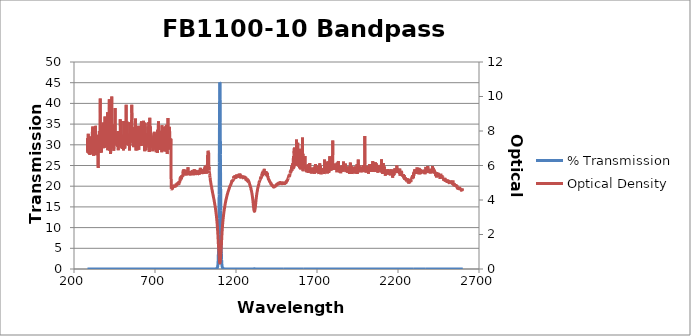
| Category | % Transmission |
|---|---|
| 2600.0 | 0.002 |
| 2599.0 | 0.002 |
| 2598.0 | 0.002 |
| 2597.0 | 0.003 |
| 2596.0 | 0.003 |
| 2595.0 | 0.003 |
| 2594.0 | 0.003 |
| 2593.0 | 0.003 |
| 2592.0 | 0.002 |
| 2591.0 | 0.003 |
| 2590.0 | 0.003 |
| 2589.0 | 0.003 |
| 2588.0 | 0.002 |
| 2587.0 | 0.002 |
| 2586.0 | 0.002 |
| 2585.0 | 0.002 |
| 2584.0 | 0.002 |
| 2583.0 | 0.002 |
| 2582.0 | 0.003 |
| 2581.0 | 0.002 |
| 2580.0 | 0.002 |
| 2579.0 | 0.002 |
| 2578.0 | 0.002 |
| 2577.0 | 0.002 |
| 2576.0 | 0.002 |
| 2575.0 | 0.002 |
| 2574.0 | 0.002 |
| 2573.0 | 0.002 |
| 2572.0 | 0.002 |
| 2571.0 | 0.002 |
| 2570.0 | 0.002 |
| 2569.0 | 0.002 |
| 2568.0 | 0.002 |
| 2567.0 | 0.002 |
| 2566.0 | 0.002 |
| 2565.0 | 0.002 |
| 2564.0 | 0.002 |
| 2563.0 | 0.002 |
| 2562.0 | 0.002 |
| 2561.0 | 0.002 |
| 2560.0 | 0.002 |
| 2559.0 | 0.001 |
| 2558.0 | 0.001 |
| 2557.0 | 0.002 |
| 2556.0 | 0.001 |
| 2555.0 | 0.001 |
| 2554.0 | 0.001 |
| 2553.0 | 0.002 |
| 2552.0 | 0.001 |
| 2551.0 | 0.001 |
| 2550.0 | 0.001 |
| 2549.0 | 0.001 |
| 2548.0 | 0.001 |
| 2547.0 | 0.001 |
| 2546.0 | 0.001 |
| 2545.0 | 0.001 |
| 2544.0 | 0.001 |
| 2543.0 | 0.001 |
| 2542.0 | 0.001 |
| 2541.0 | 0.001 |
| 2540.0 | 0.001 |
| 2539.0 | 0.001 |
| 2538.0 | 0.001 |
| 2537.0 | 0.001 |
| 2536.0 | 0.001 |
| 2535.0 | 0.001 |
| 2534.0 | 0.001 |
| 2533.0 | 0.001 |
| 2532.0 | 0.001 |
| 2531.0 | 0.001 |
| 2530.0 | 0.001 |
| 2529.0 | 0.001 |
| 2528.0 | 0.001 |
| 2527.0 | 0.001 |
| 2526.0 | 0.001 |
| 2525.0 | 0.001 |
| 2524.0 | 0.001 |
| 2523.0 | 0.001 |
| 2522.0 | 0.001 |
| 2521.0 | 0.001 |
| 2520.0 | 0.001 |
| 2519.0 | 0.001 |
| 2518.0 | 0.001 |
| 2517.0 | 0.001 |
| 2516.0 | 0.001 |
| 2515.0 | 0.001 |
| 2514.0 | 0.001 |
| 2513.0 | 0.001 |
| 2512.0 | 0.001 |
| 2511.0 | 0.001 |
| 2510.0 | 0.001 |
| 2509.0 | 0.001 |
| 2508.0 | 0.001 |
| 2507.0 | 0.001 |
| 2506.0 | 0.001 |
| 2505.0 | 0.001 |
| 2504.0 | 0.001 |
| 2503.0 | 0.001 |
| 2502.0 | 0.001 |
| 2501.0 | 0.001 |
| 2500.0 | 0.001 |
| 2499.0 | 0.001 |
| 2498.0 | 0.001 |
| 2497.0 | 0.001 |
| 2496.0 | 0.001 |
| 2495.0 | 0.001 |
| 2494.0 | 0.001 |
| 2493.0 | 0.001 |
| 2492.0 | 0.001 |
| 2491.0 | 0.001 |
| 2490.0 | 0.001 |
| 2489.0 | 0.001 |
| 2488.0 | 0.001 |
| 2487.0 | 0.001 |
| 2486.0 | 0.001 |
| 2485.0 | 0.001 |
| 2484.0 | 0.001 |
| 2483.0 | 0.001 |
| 2482.0 | 0.001 |
| 2481.0 | 0.001 |
| 2480.0 | 0.001 |
| 2479.0 | 0.001 |
| 2478.0 | 0.001 |
| 2477.0 | 0.001 |
| 2476.0 | 0 |
| 2475.0 | 0 |
| 2474.0 | 0.001 |
| 2473.0 | 0 |
| 2472.0 | 0.001 |
| 2471.0 | 0 |
| 2470.0 | 0 |
| 2469.0 | 0 |
| 2468.0 | 0 |
| 2467.0 | 0.001 |
| 2466.0 | 0 |
| 2465.0 | 0 |
| 2464.0 | 0 |
| 2463.0 | 0 |
| 2462.0 | 0 |
| 2461.0 | 0 |
| 2460.0 | 0.001 |
| 2459.0 | 0 |
| 2458.0 | 0 |
| 2457.0 | 0 |
| 2456.0 | 0 |
| 2455.0 | 0 |
| 2454.0 | 0 |
| 2453.0 | 0 |
| 2452.0 | 0 |
| 2451.0 | 0 |
| 2450.0 | 0 |
| 2449.0 | 0 |
| 2448.0 | 0 |
| 2447.0 | 0 |
| 2446.0 | 0 |
| 2445.0 | 0 |
| 2444.0 | 0 |
| 2443.0 | 0 |
| 2442.0 | 0 |
| 2441.0 | 0 |
| 2440.0 | 0 |
| 2439.0 | 0 |
| 2438.0 | 0 |
| 2437.0 | 0 |
| 2436.0 | 0 |
| 2435.0 | 0 |
| 2434.0 | 0 |
| 2433.0 | 0 |
| 2432.0 | 0 |
| 2431.0 | 0 |
| 2430.0 | 0 |
| 2429.0 | 0 |
| 2428.0 | 0 |
| 2427.0 | 0 |
| 2426.0 | 0 |
| 2425.0 | 0 |
| 2424.0 | 0 |
| 2423.0 | 0 |
| 2422.0 | 0 |
| 2421.0 | 0 |
| 2420.0 | 0 |
| 2419.0 | 0 |
| 2418.0 | 0 |
| 2417.0 | 0 |
| 2416.0 | 0 |
| 2415.0 | 0 |
| 2414.0 | 0 |
| 2413.0 | 0 |
| 2412.0 | 0 |
| 2411.0 | 0 |
| 2410.0 | 0 |
| 2409.0 | 0 |
| 2408.0 | 0 |
| 2407.0 | 0 |
| 2406.0 | 0 |
| 2405.0 | 0 |
| 2404.0 | 0 |
| 2403.0 | 0 |
| 2402.0 | 0 |
| 2401.0 | 0 |
| 2400.0 | 0 |
| 2399.0 | 0 |
| 2398.0 | 0 |
| 2397.0 | 0 |
| 2396.0 | 0 |
| 2395.0 | 0 |
| 2394.0 | 0 |
| 2393.0 | 0 |
| 2392.0 | 0 |
| 2391.0 | 0 |
| 2390.0 | 0 |
| 2389.0 | 0 |
| 2388.0 | 0 |
| 2387.0 | 0 |
| 2386.0 | 0 |
| 2385.0 | 0 |
| 2384.0 | 0 |
| 2383.0 | 0 |
| 2382.0 | 0 |
| 2381.0 | 0 |
| 2380.0 | 0 |
| 2379.0 | 0 |
| 2378.0 | 0 |
| 2377.0 | 0 |
| 2376.0 | 0 |
| 2375.0 | 0 |
| 2374.0 | 0 |
| 2373.0 | 0 |
| 2372.0 | 0 |
| 2371.0 | 0 |
| 2370.0 | 0 |
| 2369.0 | 0 |
| 2368.0 | 0 |
| 2367.0 | 0 |
| 2366.0 | 0 |
| 2365.0 | 0 |
| 2364.0 | 0 |
| 2363.0 | 0 |
| 2362.0 | 0 |
| 2361.0 | 0 |
| 2360.0 | 0 |
| 2359.0 | 0 |
| 2358.0 | 0 |
| 2357.0 | 0 |
| 2356.0 | 0 |
| 2355.0 | 0 |
| 2354.0 | 0 |
| 2353.0 | 0 |
| 2352.0 | 0 |
| 2351.0 | 0 |
| 2350.0 | 0 |
| 2349.0 | 0 |
| 2348.0 | 0 |
| 2347.0 | 0 |
| 2346.0 | 0 |
| 2345.0 | 0 |
| 2344.0 | 0 |
| 2343.0 | 0 |
| 2342.0 | 0 |
| 2341.0 | 0 |
| 2340.0 | 0 |
| 2339.0 | 0 |
| 2338.0 | 0 |
| 2337.0 | 0 |
| 2336.0 | 0 |
| 2335.0 | 0 |
| 2334.0 | 0 |
| 2333.0 | 0 |
| 2332.0 | 0 |
| 2331.0 | 0 |
| 2330.0 | 0 |
| 2329.0 | 0 |
| 2328.0 | 0 |
| 2327.0 | 0 |
| 2326.0 | 0 |
| 2325.0 | 0 |
| 2324.0 | 0 |
| 2323.0 | 0 |
| 2322.0 | 0 |
| 2321.0 | 0 |
| 2320.0 | 0 |
| 2319.0 | 0 |
| 2318.0 | 0 |
| 2317.0 | 0 |
| 2316.0 | 0 |
| 2315.0 | 0 |
| 2314.0 | 0 |
| 2313.0 | 0 |
| 2312.0 | 0 |
| 2311.0 | 0 |
| 2310.0 | 0 |
| 2309.0 | 0 |
| 2308.0 | 0 |
| 2307.0 | 0 |
| 2306.0 | 0 |
| 2305.0 | 0 |
| 2304.0 | 0 |
| 2303.0 | 0 |
| 2302.0 | 0 |
| 2301.0 | 0 |
| 2300.0 | 0 |
| 2299.0 | 0 |
| 2298.0 | 0 |
| 2297.0 | 0 |
| 2296.0 | 0 |
| 2295.0 | 0.001 |
| 2294.0 | 0 |
| 2293.0 | 0.001 |
| 2292.0 | 0 |
| 2291.0 | 0 |
| 2290.0 | 0.001 |
| 2289.0 | 0 |
| 2288.0 | 0.001 |
| 2287.0 | 0 |
| 2286.0 | 0.001 |
| 2285.0 | 0.001 |
| 2284.0 | 0.001 |
| 2283.0 | 0.001 |
| 2282.0 | 0.001 |
| 2281.0 | 0.001 |
| 2280.0 | 0.001 |
| 2279.0 | 0.001 |
| 2278.0 | 0.001 |
| 2277.0 | 0.001 |
| 2276.0 | 0.001 |
| 2275.0 | 0.001 |
| 2274.0 | 0.001 |
| 2273.0 | 0.001 |
| 2272.0 | 0.001 |
| 2271.0 | 0.001 |
| 2270.0 | 0.001 |
| 2269.0 | 0.001 |
| 2268.0 | 0.001 |
| 2267.0 | 0.001 |
| 2266.0 | 0.001 |
| 2265.0 | 0.001 |
| 2264.0 | 0.001 |
| 2263.0 | 0.001 |
| 2262.0 | 0.001 |
| 2261.0 | 0.001 |
| 2260.0 | 0.001 |
| 2259.0 | 0.001 |
| 2258.0 | 0.001 |
| 2257.0 | 0.001 |
| 2256.0 | 0.001 |
| 2255.0 | 0.001 |
| 2254.0 | 0.001 |
| 2253.0 | 0.001 |
| 2252.0 | 0.001 |
| 2251.0 | 0.001 |
| 2250.0 | 0.001 |
| 2249.0 | 0.001 |
| 2248.0 | 0.001 |
| 2247.0 | 0.001 |
| 2246.0 | 0.001 |
| 2245.0 | 0.001 |
| 2244.0 | 0 |
| 2243.0 | 0.001 |
| 2242.0 | 0.001 |
| 2241.0 | 0 |
| 2240.0 | 0.001 |
| 2239.0 | 0 |
| 2238.0 | 0 |
| 2237.0 | 0 |
| 2236.0 | 0.001 |
| 2235.0 | 0 |
| 2234.0 | 0 |
| 2233.0 | 0 |
| 2232.0 | 0 |
| 2231.0 | 0 |
| 2230.0 | 0 |
| 2229.0 | 0 |
| 2228.0 | 0 |
| 2227.0 | 0 |
| 2226.0 | 0 |
| 2225.0 | 0 |
| 2224.0 | 0 |
| 2223.0 | 0 |
| 2222.0 | 0 |
| 2221.0 | 0 |
| 2220.0 | 0 |
| 2219.0 | 0 |
| 2218.0 | 0 |
| 2217.0 | 0 |
| 2216.0 | 0 |
| 2215.0 | 0 |
| 2214.0 | 0 |
| 2213.0 | 0 |
| 2212.0 | 0 |
| 2211.0 | 0 |
| 2210.0 | 0 |
| 2209.0 | 0 |
| 2208.0 | 0 |
| 2207.0 | 0 |
| 2206.0 | 0 |
| 2205.0 | 0 |
| 2204.0 | 0 |
| 2203.0 | 0 |
| 2202.0 | 0 |
| 2201.0 | 0 |
| 2200.0 | 0 |
| 2199.0 | 0 |
| 2198.0 | 0 |
| 2197.0 | 0 |
| 2196.0 | 0 |
| 2195.0 | 0 |
| 2194.0 | 0 |
| 2193.0 | 0 |
| 2192.0 | 0 |
| 2191.0 | 0 |
| 2190.0 | 0 |
| 2189.0 | 0 |
| 2188.0 | 0 |
| 2187.0 | 0 |
| 2186.0 | 0 |
| 2185.0 | 0 |
| 2184.0 | 0 |
| 2183.0 | 0 |
| 2182.0 | 0 |
| 2181.0 | 0 |
| 2180.0 | 0 |
| 2179.0 | 0 |
| 2178.0 | 0 |
| 2177.0 | 0 |
| 2176.0 | 0 |
| 2175.0 | 0 |
| 2174.0 | 0 |
| 2173.0 | 0 |
| 2172.0 | 0 |
| 2171.0 | 0 |
| 2170.0 | 0 |
| 2169.0 | 0 |
| 2168.0 | 0 |
| 2167.0 | 0.001 |
| 2166.0 | 0 |
| 2165.0 | 0 |
| 2164.0 | 0 |
| 2163.0 | 0 |
| 2162.0 | 0 |
| 2161.0 | 0 |
| 2160.0 | 0 |
| 2159.0 | 0 |
| 2158.0 | 0 |
| 2157.0 | 0 |
| 2156.0 | 0 |
| 2155.0 | 0 |
| 2154.0 | 0 |
| 2153.0 | 0 |
| 2152.0 | 0 |
| 2151.0 | 0 |
| 2150.0 | 0 |
| 2149.0 | 0 |
| 2148.0 | 0 |
| 2147.0 | 0 |
| 2146.0 | 0 |
| 2145.0 | 0 |
| 2144.0 | 0 |
| 2143.0 | 0 |
| 2142.0 | 0 |
| 2141.0 | 0 |
| 2140.0 | 0 |
| 2139.0 | 0 |
| 2138.0 | 0 |
| 2137.0 | 0 |
| 2136.0 | 0 |
| 2135.0 | 0 |
| 2134.0 | 0 |
| 2133.0 | 0 |
| 2132.0 | 0 |
| 2131.0 | 0 |
| 2130.0 | 0 |
| 2129.0 | 0 |
| 2128.0 | 0 |
| 2127.0 | 0 |
| 2126.0 | 0 |
| 2125.0 | 0 |
| 2124.0 | 0 |
| 2123.0 | 0 |
| 2122.0 | 0 |
| 2121.0 | 0 |
| 2120.0 | 0 |
| 2119.0 | 0 |
| 2118.0 | 0 |
| 2117.0 | 0 |
| 2116.0 | 0 |
| 2115.0 | 0 |
| 2114.0 | 0 |
| 2113.0 | 0 |
| 2112.0 | 0 |
| 2111.0 | 0 |
| 2110.0 | 0 |
| 2109.0 | 0 |
| 2108.0 | 0 |
| 2107.0 | 0 |
| 2106.0 | 0 |
| 2105.0 | 0 |
| 2104.0 | 0 |
| 2103.0 | 0 |
| 2102.0 | 0 |
| 2101.0 | 0 |
| 2100.0 | 0 |
| 2099.0 | 0 |
| 2098.0 | 0 |
| 2097.0 | 0 |
| 2096.0 | 0 |
| 2095.0 | 0 |
| 2094.0 | 0 |
| 2093.0 | 0 |
| 2092.0 | 0 |
| 2091.0 | 0 |
| 2090.0 | 0 |
| 2089.0 | 0 |
| 2088.0 | 0 |
| 2087.0 | 0 |
| 2086.0 | 0 |
| 2085.0 | 0 |
| 2084.0 | 0 |
| 2083.0 | 0 |
| 2082.0 | 0 |
| 2081.0 | 0 |
| 2080.0 | 0 |
| 2079.0 | 0 |
| 2078.0 | 0 |
| 2077.0 | 0 |
| 2076.0 | 0 |
| 2075.0 | 0 |
| 2074.0 | 0 |
| 2073.0 | 0 |
| 2072.0 | 0 |
| 2071.0 | 0 |
| 2070.0 | 0 |
| 2069.0 | 0 |
| 2068.0 | 0 |
| 2067.0 | 0 |
| 2066.0 | 0 |
| 2065.0 | 0 |
| 2064.0 | 0 |
| 2063.0 | 0 |
| 2062.0 | 0 |
| 2061.0 | 0 |
| 2060.0 | 0 |
| 2059.0 | 0 |
| 2058.0 | 0 |
| 2057.0 | 0 |
| 2056.0 | 0 |
| 2055.0 | 0 |
| 2054.0 | 0 |
| 2053.0 | 0 |
| 2052.0 | 0 |
| 2051.0 | 0 |
| 2050.0 | 0 |
| 2049.0 | 0 |
| 2048.0 | 0 |
| 2047.0 | 0 |
| 2046.0 | 0 |
| 2045.0 | 0 |
| 2044.0 | 0 |
| 2043.0 | 0 |
| 2042.0 | 0 |
| 2041.0 | 0 |
| 2040.0 | 0 |
| 2039.0 | 0 |
| 2038.0 | 0 |
| 2037.0 | 0 |
| 2036.0 | 0 |
| 2035.0 | 0 |
| 2034.0 | 0 |
| 2033.0 | 0 |
| 2032.0 | 0 |
| 2031.0 | 0 |
| 2030.0 | 0 |
| 2029.0 | 0 |
| 2028.0 | 0 |
| 2027.0 | 0 |
| 2026.0 | 0 |
| 2025.0 | 0 |
| 2024.0 | 0 |
| 2023.0 | 0 |
| 2022.0 | 0 |
| 2021.0 | 0 |
| 2020.0 | 0 |
| 2019.0 | 0 |
| 2018.0 | 0 |
| 2017.0 | 0 |
| 2016.0 | 0 |
| 2015.0 | 0 |
| 2014.0 | 0 |
| 2013.0 | 0 |
| 2012.0 | 0 |
| 2011.0 | 0 |
| 2010.0 | 0 |
| 2009.0 | 0 |
| 2008.0 | 0 |
| 2007.0 | 0 |
| 2006.0 | 0 |
| 2005.0 | 0 |
| 2004.0 | 0 |
| 2003.0 | 0 |
| 2002.0 | 0 |
| 2001.0 | 0 |
| 2000.0 | 0 |
| 1999.0 | 0 |
| 1998.0 | 0 |
| 1997.0 | 0 |
| 1996.0 | 0 |
| 1995.0 | 0 |
| 1994.0 | 0 |
| 1993.0 | 0 |
| 1992.0 | 0 |
| 1991.0 | 0 |
| 1990.0 | 0 |
| 1989.0 | 0 |
| 1988.0 | 0 |
| 1987.0 | 0 |
| 1986.0 | 0 |
| 1985.0 | 0 |
| 1984.0 | 0 |
| 1983.0 | 0 |
| 1982.0 | 0 |
| 1981.0 | 0 |
| 1980.0 | 0 |
| 1979.0 | 0 |
| 1978.0 | 0 |
| 1977.0 | 0 |
| 1976.0 | 0 |
| 1975.0 | 0 |
| 1974.0 | 0 |
| 1973.0 | 0 |
| 1972.0 | 0 |
| 1971.0 | 0 |
| 1970.0 | 0 |
| 1969.0 | 0 |
| 1968.0 | 0 |
| 1967.0 | 0 |
| 1966.0 | 0 |
| 1965.0 | 0 |
| 1964.0 | 0 |
| 1963.0 | 0 |
| 1962.0 | 0 |
| 1961.0 | 0 |
| 1960.0 | 0 |
| 1959.0 | 0 |
| 1958.0 | 0 |
| 1957.0 | 0 |
| 1956.0 | 0 |
| 1955.0 | 0 |
| 1954.0 | 0 |
| 1953.0 | 0 |
| 1952.0 | 0 |
| 1951.0 | 0 |
| 1950.0 | 0 |
| 1949.0 | 0 |
| 1948.0 | 0 |
| 1947.0 | 0 |
| 1946.0 | 0 |
| 1945.0 | 0 |
| 1944.0 | 0 |
| 1943.0 | 0 |
| 1942.0 | 0 |
| 1941.0 | 0 |
| 1940.0 | 0 |
| 1939.0 | 0 |
| 1938.0 | 0 |
| 1937.0 | 0 |
| 1936.0 | 0 |
| 1935.0 | 0 |
| 1934.0 | 0 |
| 1933.0 | 0 |
| 1932.0 | 0 |
| 1931.0 | 0 |
| 1930.0 | 0 |
| 1929.0 | 0 |
| 1928.0 | 0 |
| 1927.0 | 0 |
| 1926.0 | 0 |
| 1925.0 | 0 |
| 1924.0 | 0 |
| 1923.0 | 0 |
| 1922.0 | 0 |
| 1921.0 | 0 |
| 1920.0 | 0 |
| 1919.0 | 0 |
| 1918.0 | 0 |
| 1917.0 | 0 |
| 1916.0 | 0 |
| 1915.0 | 0 |
| 1914.0 | 0 |
| 1913.0 | 0 |
| 1912.0 | 0 |
| 1911.0 | 0 |
| 1910.0 | 0 |
| 1909.0 | 0 |
| 1908.0 | 0 |
| 1907.0 | 0 |
| 1906.0 | 0 |
| 1905.0 | 0 |
| 1904.0 | 0 |
| 1903.0 | 0 |
| 1902.0 | 0 |
| 1901.0 | 0 |
| 1900.0 | 0 |
| 1899.0 | 0 |
| 1898.0 | 0 |
| 1897.0 | 0 |
| 1896.0 | 0 |
| 1895.0 | 0 |
| 1894.0 | 0 |
| 1893.0 | 0 |
| 1892.0 | 0 |
| 1891.0 | 0 |
| 1890.0 | 0 |
| 1889.0 | 0 |
| 1888.0 | 0 |
| 1887.0 | 0 |
| 1886.0 | 0 |
| 1885.0 | 0 |
| 1884.0 | 0 |
| 1883.0 | 0 |
| 1882.0 | 0 |
| 1881.0 | 0 |
| 1880.0 | 0 |
| 1879.0 | 0 |
| 1878.0 | 0 |
| 1877.0 | 0 |
| 1876.0 | 0 |
| 1875.0 | 0 |
| 1874.0 | 0 |
| 1873.0 | 0 |
| 1872.0 | 0 |
| 1871.0 | 0 |
| 1870.0 | 0 |
| 1869.0 | 0 |
| 1868.0 | 0 |
| 1867.0 | 0 |
| 1866.0 | 0 |
| 1865.0 | 0 |
| 1864.0 | 0 |
| 1863.0 | 0 |
| 1862.0 | 0 |
| 1861.0 | 0 |
| 1860.0 | 0 |
| 1859.0 | 0 |
| 1858.0 | 0 |
| 1857.0 | 0 |
| 1856.0 | 0 |
| 1855.0 | 0 |
| 1854.0 | 0 |
| 1853.0 | 0 |
| 1852.0 | 0 |
| 1851.0 | 0 |
| 1850.0 | 0 |
| 1849.0 | 0 |
| 1848.0 | 0 |
| 1847.0 | 0 |
| 1846.0 | 0 |
| 1845.0 | 0 |
| 1844.0 | 0 |
| 1843.0 | 0 |
| 1842.0 | 0 |
| 1841.0 | 0 |
| 1840.0 | 0 |
| 1839.0 | 0 |
| 1838.0 | 0 |
| 1837.0 | 0 |
| 1836.0 | 0 |
| 1835.0 | 0 |
| 1834.0 | 0 |
| 1833.0 | 0 |
| 1832.0 | 0 |
| 1831.0 | 0 |
| 1830.0 | 0 |
| 1829.0 | 0 |
| 1828.0 | 0 |
| 1827.0 | 0 |
| 1826.0 | 0 |
| 1825.0 | 0 |
| 1824.0 | 0 |
| 1823.0 | 0 |
| 1822.0 | 0 |
| 1821.0 | 0 |
| 1820.0 | 0 |
| 1819.0 | 0 |
| 1818.0 | 0 |
| 1817.0 | 0 |
| 1816.0 | 0 |
| 1815.0 | 0 |
| 1814.0 | 0 |
| 1813.0 | 0 |
| 1812.0 | 0 |
| 1811.0 | 0 |
| 1810.0 | 0 |
| 1809.0 | 0 |
| 1808.0 | 0 |
| 1807.0 | 0 |
| 1806.0 | 0 |
| 1805.0 | 0 |
| 1804.0 | 0 |
| 1803.0 | 0 |
| 1802.0 | 0 |
| 1801.0 | 0 |
| 1800.0 | 0 |
| 1799.0 | 0 |
| 1798.0 | 0 |
| 1797.0 | 0 |
| 1796.0 | 0 |
| 1795.0 | 0 |
| 1794.0 | 0 |
| 1793.0 | 0 |
| 1792.0 | 0 |
| 1791.0 | 0 |
| 1790.0 | 0 |
| 1789.0 | 0 |
| 1788.0 | 0 |
| 1787.0 | 0 |
| 1786.0 | 0 |
| 1785.0 | 0 |
| 1784.0 | 0 |
| 1783.0 | 0 |
| 1782.0 | 0 |
| 1781.0 | 0 |
| 1780.0 | 0 |
| 1779.0 | 0 |
| 1778.0 | 0 |
| 1777.0 | 0 |
| 1776.0 | 0 |
| 1775.0 | 0 |
| 1774.0 | 0 |
| 1773.0 | 0 |
| 1772.0 | 0 |
| 1771.0 | 0 |
| 1770.0 | 0 |
| 1769.0 | 0 |
| 1768.0 | 0 |
| 1767.0 | 0 |
| 1766.0 | 0 |
| 1765.0 | 0 |
| 1764.0 | 0 |
| 1763.0 | 0 |
| 1762.0 | 0 |
| 1761.0 | 0 |
| 1760.0 | 0 |
| 1759.0 | 0 |
| 1758.0 | 0 |
| 1757.0 | 0 |
| 1756.0 | 0 |
| 1755.0 | 0 |
| 1754.0 | 0 |
| 1753.0 | 0 |
| 1752.0 | 0 |
| 1751.0 | 0 |
| 1750.0 | 0 |
| 1749.0 | 0 |
| 1748.0 | 0 |
| 1747.0 | 0 |
| 1746.0 | 0 |
| 1745.0 | 0 |
| 1744.0 | 0 |
| 1743.0 | 0 |
| 1742.0 | 0 |
| 1741.0 | 0 |
| 1740.0 | 0 |
| 1739.0 | 0 |
| 1738.0 | 0 |
| 1737.0 | 0 |
| 1736.0 | 0 |
| 1735.0 | 0 |
| 1734.0 | 0 |
| 1733.0 | 0 |
| 1732.0 | 0 |
| 1731.0 | 0 |
| 1730.0 | 0 |
| 1729.0 | 0 |
| 1728.0 | 0 |
| 1727.0 | 0 |
| 1726.0 | 0 |
| 1725.0 | 0 |
| 1724.0 | 0 |
| 1723.0 | 0 |
| 1722.0 | 0 |
| 1721.0 | 0 |
| 1720.0 | 0 |
| 1719.0 | 0 |
| 1718.0 | 0 |
| 1717.0 | 0 |
| 1716.0 | 0 |
| 1715.0 | 0 |
| 1714.0 | 0 |
| 1713.0 | 0 |
| 1712.0 | 0 |
| 1711.0 | 0 |
| 1710.0 | 0 |
| 1709.0 | 0 |
| 1708.0 | 0 |
| 1707.0 | 0 |
| 1706.0 | 0 |
| 1705.0 | 0 |
| 1704.0 | 0 |
| 1703.0 | 0 |
| 1702.0 | 0 |
| 1701.0 | 0 |
| 1700.0 | 0 |
| 1699.0 | 0 |
| 1698.0 | 0 |
| 1697.0 | 0 |
| 1696.0 | 0 |
| 1695.0 | 0 |
| 1694.0 | 0 |
| 1693.0 | 0 |
| 1692.0 | 0 |
| 1691.0 | 0 |
| 1690.0 | 0 |
| 1689.0 | 0 |
| 1688.0 | 0 |
| 1687.0 | 0 |
| 1686.0 | 0 |
| 1685.0 | 0 |
| 1684.0 | 0 |
| 1683.0 | 0 |
| 1682.0 | 0 |
| 1681.0 | 0 |
| 1680.0 | 0 |
| 1679.0 | 0 |
| 1678.0 | 0 |
| 1677.0 | 0 |
| 1676.0 | 0 |
| 1675.0 | 0 |
| 1674.0 | 0 |
| 1673.0 | 0 |
| 1672.0 | 0 |
| 1671.0 | 0 |
| 1670.0 | 0 |
| 1669.0 | 0 |
| 1668.0 | 0 |
| 1667.0 | 0 |
| 1666.0 | 0 |
| 1665.0 | 0 |
| 1664.0 | 0 |
| 1663.0 | 0 |
| 1662.0 | 0 |
| 1661.0 | 0 |
| 1660.0 | 0 |
| 1659.0 | 0 |
| 1658.0 | 0 |
| 1657.0 | 0 |
| 1656.0 | 0 |
| 1655.0 | 0 |
| 1654.0 | 0 |
| 1653.0 | 0 |
| 1652.0 | 0 |
| 1651.0 | 0 |
| 1650.0 | 0 |
| 1649.0 | 0 |
| 1648.0 | 0 |
| 1647.0 | 0 |
| 1646.0 | 0 |
| 1645.0 | 0 |
| 1644.0 | 0 |
| 1643.0 | 0 |
| 1642.0 | 0 |
| 1641.0 | 0 |
| 1640.0 | 0 |
| 1639.0 | 0 |
| 1638.0 | 0 |
| 1637.0 | 0 |
| 1636.0 | 0 |
| 1635.0 | 0 |
| 1634.0 | 0 |
| 1633.0 | 0 |
| 1632.0 | 0 |
| 1631.0 | 0 |
| 1630.0 | 0 |
| 1629.0 | 0 |
| 1628.0 | 0 |
| 1627.0 | 0 |
| 1626.0 | 0 |
| 1625.0 | 0 |
| 1624.0 | 0 |
| 1623.0 | 0 |
| 1622.0 | 0 |
| 1621.0 | 0 |
| 1620.0 | 0 |
| 1619.0 | 0 |
| 1618.0 | 0 |
| 1617.0 | 0 |
| 1616.0 | 0 |
| 1615.0 | 0 |
| 1614.0 | 0 |
| 1613.0 | 0 |
| 1612.0 | 0 |
| 1611.0 | 0 |
| 1610.0 | 0 |
| 1609.0 | 0 |
| 1608.0 | 0 |
| 1607.0 | 0 |
| 1606.0 | 0 |
| 1605.0 | 0 |
| 1604.0 | 0 |
| 1603.0 | 0 |
| 1602.0 | 0 |
| 1601.0 | 0 |
| 1600.0 | 0 |
| 1599.0 | 0 |
| 1598.0 | 0 |
| 1597.0 | 0 |
| 1596.0 | 0 |
| 1595.0 | 0 |
| 1594.0 | 0 |
| 1593.0 | 0 |
| 1592.0 | 0 |
| 1591.0 | 0 |
| 1590.0 | 0 |
| 1589.0 | 0 |
| 1588.0 | 0 |
| 1587.0 | 0 |
| 1586.0 | 0 |
| 1585.0 | 0 |
| 1584.0 | 0 |
| 1583.0 | 0 |
| 1582.0 | 0 |
| 1581.0 | 0 |
| 1580.0 | 0 |
| 1579.0 | 0 |
| 1578.0 | 0 |
| 1577.0 | 0 |
| 1576.0 | 0 |
| 1575.0 | 0 |
| 1574.0 | 0 |
| 1573.0 | 0 |
| 1572.0 | 0 |
| 1571.0 | 0 |
| 1570.0 | 0 |
| 1569.0 | 0 |
| 1568.0 | 0 |
| 1567.0 | 0 |
| 1566.0 | 0 |
| 1565.0 | 0 |
| 1564.0 | 0 |
| 1563.0 | 0 |
| 1562.0 | 0 |
| 1561.0 | 0 |
| 1560.0 | 0 |
| 1559.0 | 0 |
| 1558.0 | 0 |
| 1557.0 | 0 |
| 1556.0 | 0 |
| 1555.0 | 0 |
| 1554.0 | 0 |
| 1553.0 | 0 |
| 1552.0 | 0 |
| 1551.0 | 0 |
| 1550.0 | 0 |
| 1549.0 | 0 |
| 1548.0 | 0 |
| 1547.0 | 0 |
| 1546.0 | 0 |
| 1545.0 | 0 |
| 1544.0 | 0 |
| 1543.0 | 0 |
| 1542.0 | 0 |
| 1541.0 | 0 |
| 1540.0 | 0 |
| 1539.0 | 0 |
| 1538.0 | 0 |
| 1537.0 | 0 |
| 1536.0 | 0 |
| 1535.0 | 0 |
| 1534.0 | 0 |
| 1533.0 | 0 |
| 1532.0 | 0 |
| 1531.0 | 0 |
| 1530.0 | 0 |
| 1529.0 | 0 |
| 1528.0 | 0 |
| 1527.0 | 0 |
| 1526.0 | 0 |
| 1525.0 | 0 |
| 1524.0 | 0.001 |
| 1523.0 | 0 |
| 1522.0 | 0.001 |
| 1521.0 | 0.001 |
| 1520.0 | 0.001 |
| 1519.0 | 0.001 |
| 1518.0 | 0.001 |
| 1517.0 | 0.001 |
| 1516.0 | 0.001 |
| 1515.0 | 0.001 |
| 1514.0 | 0.001 |
| 1513.0 | 0.001 |
| 1512.0 | 0.001 |
| 1511.0 | 0.001 |
| 1510.0 | 0.001 |
| 1509.0 | 0.001 |
| 1508.0 | 0.001 |
| 1507.0 | 0.001 |
| 1506.0 | 0.001 |
| 1505.0 | 0.001 |
| 1504.0 | 0.001 |
| 1503.0 | 0.001 |
| 1502.0 | 0.001 |
| 1501.0 | 0.001 |
| 1500.0 | 0.001 |
| 1499.0 | 0.001 |
| 1498.0 | 0.001 |
| 1497.0 | 0.001 |
| 1496.0 | 0.001 |
| 1495.0 | 0.001 |
| 1494.0 | 0.001 |
| 1493.0 | 0.001 |
| 1492.0 | 0.001 |
| 1491.0 | 0.001 |
| 1490.0 | 0.001 |
| 1489.0 | 0.001 |
| 1488.0 | 0.001 |
| 1487.0 | 0.001 |
| 1486.0 | 0.001 |
| 1485.0 | 0.001 |
| 1484.0 | 0.001 |
| 1483.0 | 0.001 |
| 1482.0 | 0.001 |
| 1481.0 | 0.001 |
| 1480.0 | 0.001 |
| 1479.0 | 0.001 |
| 1478.0 | 0.001 |
| 1477.0 | 0.001 |
| 1476.0 | 0.001 |
| 1475.0 | 0.001 |
| 1474.0 | 0.001 |
| 1473.0 | 0.001 |
| 1472.0 | 0.001 |
| 1471.0 | 0.001 |
| 1470.0 | 0.001 |
| 1469.0 | 0.001 |
| 1468.0 | 0.001 |
| 1467.0 | 0.001 |
| 1466.0 | 0.001 |
| 1465.0 | 0.001 |
| 1464.0 | 0.001 |
| 1463.0 | 0.001 |
| 1462.0 | 0.001 |
| 1461.0 | 0.001 |
| 1460.0 | 0.001 |
| 1459.0 | 0.001 |
| 1458.0 | 0.001 |
| 1457.0 | 0.001 |
| 1456.0 | 0.001 |
| 1455.0 | 0.001 |
| 1454.0 | 0.001 |
| 1453.0 | 0.001 |
| 1452.0 | 0.001 |
| 1451.0 | 0.001 |
| 1450.0 | 0.001 |
| 1449.0 | 0.001 |
| 1448.0 | 0.001 |
| 1447.0 | 0.001 |
| 1446.0 | 0.001 |
| 1445.0 | 0.002 |
| 1444.0 | 0.001 |
| 1443.0 | 0.002 |
| 1442.0 | 0.002 |
| 1441.0 | 0.002 |
| 1440.0 | 0.002 |
| 1439.0 | 0.002 |
| 1438.0 | 0.002 |
| 1437.0 | 0.002 |
| 1436.0 | 0.002 |
| 1435.0 | 0.002 |
| 1434.0 | 0.002 |
| 1433.0 | 0.002 |
| 1432.0 | 0.002 |
| 1431.0 | 0.002 |
| 1430.0 | 0.002 |
| 1429.0 | 0.002 |
| 1428.0 | 0.001 |
| 1427.0 | 0.001 |
| 1426.0 | 0.001 |
| 1425.0 | 0.002 |
| 1424.0 | 0.001 |
| 1423.0 | 0.001 |
| 1422.0 | 0.001 |
| 1421.0 | 0.001 |
| 1420.0 | 0.001 |
| 1419.0 | 0.001 |
| 1418.0 | 0.001 |
| 1417.0 | 0.001 |
| 1416.0 | 0.001 |
| 1415.0 | 0.001 |
| 1414.0 | 0.001 |
| 1413.0 | 0.001 |
| 1412.0 | 0.001 |
| 1411.0 | 0.001 |
| 1410.0 | 0.001 |
| 1409.0 | 0.001 |
| 1408.0 | 0.001 |
| 1407.0 | 0.001 |
| 1406.0 | 0.001 |
| 1405.0 | 0.001 |
| 1404.0 | 0.001 |
| 1403.0 | 0.001 |
| 1402.0 | 0.001 |
| 1401.0 | 0.001 |
| 1400.0 | 0.001 |
| 1399.0 | 0.001 |
| 1398.0 | 0.001 |
| 1397.0 | 0 |
| 1396.0 | 0 |
| 1395.0 | 0 |
| 1394.0 | 0 |
| 1393.0 | 0 |
| 1392.0 | 0 |
| 1391.0 | 0 |
| 1390.0 | 0 |
| 1389.0 | 0 |
| 1388.0 | 0 |
| 1387.0 | 0 |
| 1386.0 | 0 |
| 1385.0 | 0 |
| 1384.0 | 0 |
| 1383.0 | 0 |
| 1382.0 | 0 |
| 1381.0 | 0 |
| 1380.0 | 0 |
| 1379.0 | 0 |
| 1378.0 | 0 |
| 1377.0 | 0 |
| 1376.0 | 0 |
| 1375.0 | 0 |
| 1374.0 | 0 |
| 1373.0 | 0 |
| 1372.0 | 0 |
| 1371.0 | 0 |
| 1370.0 | 0 |
| 1369.0 | 0 |
| 1368.0 | 0 |
| 1367.0 | 0 |
| 1366.0 | 0 |
| 1365.0 | 0 |
| 1364.0 | 0 |
| 1363.0 | 0 |
| 1362.0 | 0 |
| 1361.0 | 0 |
| 1360.0 | 0 |
| 1359.0 | 0 |
| 1358.0 | 0 |
| 1357.0 | 0 |
| 1356.0 | 0 |
| 1355.0 | 0 |
| 1354.0 | 0.001 |
| 1353.0 | 0.001 |
| 1352.0 | 0.001 |
| 1351.0 | 0.001 |
| 1350.0 | 0.001 |
| 1349.0 | 0.001 |
| 1348.0 | 0.001 |
| 1347.0 | 0.001 |
| 1346.0 | 0.001 |
| 1345.0 | 0.001 |
| 1344.0 | 0.001 |
| 1343.0 | 0.001 |
| 1342.0 | 0.001 |
| 1341.0 | 0.001 |
| 1340.0 | 0.001 |
| 1339.0 | 0.001 |
| 1338.0 | 0.002 |
| 1337.0 | 0.002 |
| 1336.0 | 0.002 |
| 1335.0 | 0.002 |
| 1334.0 | 0.002 |
| 1333.0 | 0.002 |
| 1332.0 | 0.003 |
| 1331.0 | 0.003 |
| 1330.0 | 0.004 |
| 1329.0 | 0.004 |
| 1328.0 | 0.005 |
| 1327.0 | 0.005 |
| 1326.0 | 0.007 |
| 1325.0 | 0.008 |
| 1324.0 | 0.009 |
| 1323.0 | 0.012 |
| 1322.0 | 0.014 |
| 1321.0 | 0.018 |
| 1320.0 | 0.022 |
| 1319.0 | 0.027 |
| 1318.0 | 0.032 |
| 1317.0 | 0.037 |
| 1316.0 | 0.041 |
| 1315.0 | 0.044 |
| 1314.0 | 0.046 |
| 1313.0 | 0.045 |
| 1312.0 | 0.042 |
| 1311.0 | 0.039 |
| 1310.0 | 0.034 |
| 1309.0 | 0.029 |
| 1308.0 | 0.024 |
| 1307.0 | 0.019 |
| 1306.0 | 0.016 |
| 1305.0 | 0.013 |
| 1304.0 | 0.01 |
| 1303.0 | 0.009 |
| 1302.0 | 0.007 |
| 1301.0 | 0.006 |
| 1300.0 | 0.005 |
| 1299.0 | 0.005 |
| 1298.0 | 0.004 |
| 1297.0 | 0.003 |
| 1296.0 | 0.003 |
| 1295.0 | 0.003 |
| 1294.0 | 0.003 |
| 1293.0 | 0.002 |
| 1292.0 | 0.002 |
| 1291.0 | 0.002 |
| 1290.0 | 0.002 |
| 1289.0 | 0.002 |
| 1288.0 | 0.002 |
| 1287.0 | 0.001 |
| 1286.0 | 0.001 |
| 1285.0 | 0.001 |
| 1284.0 | 0.001 |
| 1283.0 | 0.001 |
| 1282.0 | 0.001 |
| 1281.0 | 0.001 |
| 1280.0 | 0.001 |
| 1279.0 | 0.001 |
| 1278.0 | 0.001 |
| 1277.0 | 0.001 |
| 1276.0 | 0.001 |
| 1275.0 | 0.001 |
| 1274.0 | 0.001 |
| 1273.0 | 0.001 |
| 1272.0 | 0.001 |
| 1271.0 | 0.001 |
| 1270.0 | 0.001 |
| 1269.0 | 0.001 |
| 1268.0 | 0.001 |
| 1267.0 | 0.001 |
| 1266.0 | 0.001 |
| 1265.0 | 0.001 |
| 1264.0 | 0.001 |
| 1263.0 | 0.001 |
| 1262.0 | 0.001 |
| 1261.0 | 0.001 |
| 1260.0 | 0.001 |
| 1259.0 | 0.001 |
| 1258.0 | 0.001 |
| 1257.0 | 0.001 |
| 1256.0 | 0 |
| 1255.0 | 0.001 |
| 1254.0 | 0.001 |
| 1253.0 | 0.001 |
| 1252.0 | 0 |
| 1251.0 | 0.001 |
| 1250.0 | 0 |
| 1249.0 | 0.001 |
| 1248.0 | 0.001 |
| 1247.0 | 0 |
| 1246.0 | 0 |
| 1245.0 | 0 |
| 1244.0 | 0 |
| 1243.0 | 0 |
| 1242.0 | 0.001 |
| 1241.0 | 0 |
| 1240.0 | 0 |
| 1239.0 | 0 |
| 1238.0 | 0 |
| 1237.0 | 0 |
| 1236.0 | 0.001 |
| 1235.0 | 0 |
| 1234.0 | 0.001 |
| 1233.0 | 0 |
| 1232.0 | 0 |
| 1231.0 | 0 |
| 1230.0 | 0 |
| 1229.0 | 0 |
| 1228.0 | 0 |
| 1227.0 | 0 |
| 1226.0 | 0 |
| 1225.0 | 0 |
| 1224.0 | 0 |
| 1223.0 | 0 |
| 1222.0 | 0 |
| 1221.0 | 0 |
| 1220.0 | 0 |
| 1219.0 | 0 |
| 1218.0 | 0 |
| 1217.0 | 0 |
| 1216.0 | 0 |
| 1215.0 | 0 |
| 1214.0 | 0 |
| 1213.0 | 0 |
| 1212.0 | 0 |
| 1211.0 | 0 |
| 1210.0 | 0 |
| 1209.0 | 0 |
| 1208.0 | 0 |
| 1207.0 | 0 |
| 1206.0 | 0 |
| 1205.0 | 0 |
| 1204.0 | 0 |
| 1203.0 | 0 |
| 1202.0 | 0 |
| 1201.0 | 0 |
| 1200.0 | 0 |
| 1199.0 | 0.001 |
| 1198.0 | 0 |
| 1197.0 | 0.001 |
| 1196.0 | 0.001 |
| 1195.0 | 0 |
| 1194.0 | 0 |
| 1193.0 | 0.001 |
| 1192.0 | 0.001 |
| 1191.0 | 0 |
| 1190.0 | 0 |
| 1189.0 | 0 |
| 1188.0 | 0.001 |
| 1187.0 | 0.001 |
| 1186.0 | 0 |
| 1185.0 | 0.001 |
| 1184.0 | 0.001 |
| 1183.0 | 0.001 |
| 1182.0 | 0.001 |
| 1181.0 | 0.001 |
| 1180.0 | 0.001 |
| 1179.0 | 0.001 |
| 1178.0 | 0.001 |
| 1177.0 | 0.001 |
| 1176.0 | 0.001 |
| 1175.0 | 0.001 |
| 1174.0 | 0.001 |
| 1173.0 | 0.001 |
| 1172.0 | 0.001 |
| 1171.0 | 0.001 |
| 1170.0 | 0.001 |
| 1169.0 | 0.001 |
| 1168.0 | 0.001 |
| 1167.0 | 0.001 |
| 1166.0 | 0.001 |
| 1165.0 | 0.001 |
| 1164.0 | 0.002 |
| 1163.0 | 0.002 |
| 1162.0 | 0.002 |
| 1161.0 | 0.002 |
| 1160.0 | 0.002 |
| 1159.0 | 0.002 |
| 1158.0 | 0.002 |
| 1157.0 | 0.002 |
| 1156.0 | 0.002 |
| 1155.0 | 0.003 |
| 1154.0 | 0.003 |
| 1153.0 | 0.003 |
| 1152.0 | 0.003 |
| 1151.0 | 0.003 |
| 1150.0 | 0.004 |
| 1149.0 | 0.004 |
| 1148.0 | 0.004 |
| 1147.0 | 0.005 |
| 1146.0 | 0.005 |
| 1145.0 | 0.005 |
| 1144.0 | 0.006 |
| 1143.0 | 0.006 |
| 1142.0 | 0.007 |
| 1141.0 | 0.008 |
| 1140.0 | 0.008 |
| 1139.0 | 0.009 |
| 1138.0 | 0.01 |
| 1137.0 | 0.011 |
| 1136.0 | 0.013 |
| 1135.0 | 0.014 |
| 1134.0 | 0.016 |
| 1133.0 | 0.018 |
| 1132.0 | 0.02 |
| 1131.0 | 0.023 |
| 1130.0 | 0.026 |
| 1129.0 | 0.03 |
| 1128.0 | 0.034 |
| 1127.0 | 0.039 |
| 1126.0 | 0.046 |
| 1125.0 | 0.054 |
| 1124.0 | 0.064 |
| 1123.0 | 0.077 |
| 1122.0 | 0.093 |
| 1121.0 | 0.113 |
| 1120.0 | 0.14 |
| 1119.0 | 0.176 |
| 1118.0 | 0.223 |
| 1117.0 | 0.29 |
| 1116.0 | 0.387 |
| 1115.0 | 0.516 |
| 1114.0 | 0.722 |
| 1113.0 | 1.032 |
| 1112.0 | 1.526 |
| 1111.0 | 2.344 |
| 1110.0 | 3.67 |
| 1109.0 | 5.303 |
| 1108.0 | 7.235 |
| 1107.0 | 10.019 |
| 1106.0 | 14.088 |
| 1105.0 | 19.94 |
| 1104.0 | 27.667 |
| 1103.0 | 35.302 |
| 1102.0 | 40.93 |
| 1101.0 | 45.075 |
| 1100.0 | 45.098 |
| 1099.0 | 40.82 |
| 1098.0 | 34.312 |
| 1097.0 | 25.67 |
| 1096.0 | 18.04 |
| 1095.0 | 12.115 |
| 1094.0 | 8.361 |
| 1093.0 | 5.956 |
| 1092.0 | 4.405 |
| 1091.0 | 3.208 |
| 1090.0 | 2.124 |
| 1089.0 | 1.4 |
| 1088.0 | 0.944 |
| 1087.0 | 0.656 |
| 1086.0 | 0.472 |
| 1085.0 | 0.345 |
| 1084.0 | 0.261 |
| 1083.0 | 0.202 |
| 1082.0 | 0.158 |
| 1081.0 | 0.126 |
| 1080.0 | 0.102 |
| 1079.0 | 0.083 |
| 1078.0 | 0.068 |
| 1077.0 | 0.057 |
| 1076.0 | 0.048 |
| 1075.0 | 0.041 |
| 1074.0 | 0.035 |
| 1073.0 | 0.03 |
| 1072.0 | 0.026 |
| 1071.0 | 0.023 |
| 1070.0 | 0.02 |
| 1069.0 | 0.017 |
| 1068.0 | 0.015 |
| 1067.0 | 0.014 |
| 1066.0 | 0.012 |
| 1065.0 | 0.011 |
| 1064.0 | 0.01 |
| 1063.0 | 0.008 |
| 1062.0 | 0.008 |
| 1061.0 | 0.007 |
| 1060.0 | 0.006 |
| 1059.0 | 0.005 |
| 1058.0 | 0.005 |
| 1057.0 | 0.004 |
| 1056.0 | 0.004 |
| 1055.0 | 0.004 |
| 1054.0 | 0.003 |
| 1053.0 | 0.003 |
| 1052.0 | 0.002 |
| 1051.0 | 0.002 |
| 1050.0 | 0.002 |
| 1049.0 | 0.002 |
| 1048.0 | 0.002 |
| 1047.0 | 0.001 |
| 1046.0 | 0.001 |
| 1045.0 | 0.001 |
| 1044.0 | 0.001 |
| 1043.0 | 0.001 |
| 1042.0 | 0.001 |
| 1041.0 | 0.001 |
| 1040.0 | 0 |
| 1039.0 | 0 |
| 1038.0 | 0 |
| 1037.0 | 0 |
| 1036.0 | 0 |
| 1035.0 | 0 |
| 1034.0 | 0 |
| 1033.0 | 0 |
| 1032.0 | 0 |
| 1031.0 | 0 |
| 1030.0 | 0 |
| 1029.0 | 0 |
| 1028.0 | 0 |
| 1027.0 | 0 |
| 1026.0 | 0 |
| 1025.0 | 0 |
| 1024.0 | 0 |
| 1023.0 | 0 |
| 1022.0 | 0 |
| 1021.0 | 0 |
| 1020.0 | 0 |
| 1019.0 | 0 |
| 1018.0 | 0 |
| 1017.0 | 0 |
| 1016.0 | 0 |
| 1015.0 | 0 |
| 1014.0 | 0 |
| 1013.0 | 0 |
| 1012.0 | 0 |
| 1011.0 | 0 |
| 1010.0 | 0 |
| 1009.0 | 0 |
| 1008.0 | 0 |
| 1007.0 | 0 |
| 1006.0 | 0 |
| 1005.0 | 0 |
| 1004.0 | 0 |
| 1003.0 | 0 |
| 1002.0 | 0 |
| 1001.0 | 0 |
| 1000.0 | 0 |
| 999.0 | 0 |
| 998.0 | 0 |
| 997.0 | 0 |
| 996.0 | 0 |
| 995.0 | 0 |
| 994.0 | 0 |
| 993.0 | 0 |
| 992.0 | 0 |
| 991.0 | 0 |
| 990.0 | 0 |
| 989.0 | 0 |
| 988.0 | 0 |
| 987.0 | 0 |
| 986.0 | 0 |
| 985.0 | 0 |
| 984.0 | 0 |
| 983.0 | 0 |
| 982.0 | 0 |
| 981.0 | 0 |
| 980.0 | 0 |
| 979.0 | 0 |
| 978.0 | 0 |
| 977.0 | 0 |
| 976.0 | 0 |
| 975.0 | 0 |
| 974.0 | 0 |
| 973.0 | 0 |
| 972.0 | 0 |
| 971.0 | 0 |
| 970.0 | 0 |
| 969.0 | 0 |
| 968.0 | 0 |
| 967.0 | 0 |
| 966.0 | 0 |
| 965.0 | 0 |
| 964.0 | 0 |
| 963.0 | 0 |
| 962.0 | 0 |
| 961.0 | 0 |
| 960.0 | 0 |
| 959.0 | 0 |
| 958.0 | 0 |
| 957.0 | 0 |
| 956.0 | 0 |
| 955.0 | 0 |
| 954.0 | 0 |
| 953.0 | 0 |
| 952.0 | 0 |
| 951.0 | 0 |
| 950.0 | 0 |
| 949.0 | 0 |
| 948.0 | 0 |
| 947.0 | 0 |
| 946.0 | 0 |
| 945.0 | 0 |
| 944.0 | 0 |
| 943.0 | 0 |
| 942.0 | 0 |
| 941.0 | 0 |
| 940.0 | 0 |
| 939.0 | 0 |
| 938.0 | 0 |
| 937.0 | 0 |
| 936.0 | 0 |
| 935.0 | 0 |
| 934.0 | 0 |
| 933.0 | 0 |
| 932.0 | 0 |
| 931.0 | 0 |
| 930.0 | 0 |
| 929.0 | 0 |
| 928.0 | 0 |
| 927.0 | 0 |
| 926.0 | 0 |
| 925.0 | 0 |
| 924.0 | 0 |
| 923.0 | 0 |
| 922.0 | 0 |
| 921.0 | 0 |
| 920.0 | 0 |
| 919.0 | 0 |
| 918.0 | 0 |
| 917.0 | 0 |
| 916.0 | 0 |
| 915.0 | 0 |
| 914.0 | 0 |
| 913.0 | 0 |
| 912.0 | 0 |
| 911.0 | 0 |
| 910.0 | 0 |
| 909.0 | 0 |
| 908.0 | 0 |
| 907.0 | 0 |
| 906.0 | 0 |
| 905.0 | 0 |
| 904.0 | 0 |
| 903.0 | 0 |
| 902.0 | 0 |
| 901.0 | 0 |
| 900.0 | 0 |
| 899.0 | 0 |
| 898.0 | 0 |
| 897.0 | 0 |
| 896.0 | 0 |
| 895.0 | 0 |
| 894.0 | 0 |
| 893.0 | 0 |
| 892.0 | 0 |
| 891.0 | 0 |
| 890.0 | 0 |
| 889.0 | 0 |
| 888.0 | 0 |
| 887.0 | 0 |
| 886.0 | 0 |
| 885.0 | 0 |
| 884.0 | 0 |
| 883.0 | 0 |
| 882.0 | 0 |
| 881.0 | 0 |
| 880.0 | 0 |
| 879.0 | 0 |
| 878.0 | 0 |
| 877.0 | 0 |
| 876.0 | 0 |
| 875.0 | 0 |
| 874.0 | 0 |
| 873.0 | 0 |
| 872.0 | 0 |
| 871.0 | 0 |
| 870.0 | 0 |
| 869.0 | 0 |
| 868.0 | 0 |
| 867.0 | 0 |
| 866.0 | 0 |
| 865.0 | 0 |
| 864.0 | 0.001 |
| 863.0 | 0.001 |
| 862.0 | 0 |
| 861.0 | 0.001 |
| 860.0 | 0.001 |
| 859.0 | 0.001 |
| 858.0 | 0.001 |
| 857.0 | 0.001 |
| 856.0 | 0 |
| 855.0 | 0.001 |
| 854.0 | 0.001 |
| 853.0 | 0.001 |
| 852.0 | 0.001 |
| 851.0 | 0.001 |
| 850.0 | 0.001 |
| 849.0 | 0.001 |
| 848.0 | 0.001 |
| 847.0 | 0.001 |
| 846.0 | 0.001 |
| 845.0 | 0.001 |
| 844.0 | 0.001 |
| 843.0 | 0.001 |
| 842.0 | 0.001 |
| 841.0 | 0.001 |
| 840.0 | 0.001 |
| 839.0 | 0.001 |
| 838.0 | 0.001 |
| 837.0 | 0.001 |
| 836.0 | 0.001 |
| 835.0 | 0.001 |
| 834.0 | 0.001 |
| 833.0 | 0.001 |
| 832.0 | 0.001 |
| 831.0 | 0.001 |
| 830.0 | 0.002 |
| 829.0 | 0.001 |
| 828.0 | 0.001 |
| 827.0 | 0.001 |
| 826.0 | 0.002 |
| 825.0 | 0.001 |
| 824.0 | 0.001 |
| 823.0 | 0.002 |
| 822.0 | 0.001 |
| 821.0 | 0.001 |
| 820.0 | 0.002 |
| 819.0 | 0.002 |
| 818.0 | 0.002 |
| 817.0 | 0.002 |
| 816.0 | 0.002 |
| 815.0 | 0.001 |
| 814.0 | 0.002 |
| 813.0 | 0.002 |
| 812.0 | 0.002 |
| 811.0 | 0.001 |
| 810.0 | 0.002 |
| 809.0 | 0.002 |
| 808.0 | 0.002 |
| 807.0 | 0.002 |
| 806.0 | 0.002 |
| 805.0 | 0.002 |
| 804.0 | 0.002 |
| 803.0 | 0.002 |
| 802.0 | 0.002 |
| 801.0 | 0.002 |
| 800.0 | 0.002 |
| 799.0 | 0 |
| 798.0 | 0 |
| 797.0 | 0 |
| 796.0 | 0 |
| 795.0 | 0 |
| 794.0 | 0 |
| 793.0 | 0 |
| 792.0 | 0 |
| 791.0 | 0 |
| 790.0 | 0 |
| 789.0 | 0 |
| 788.0 | 0 |
| 787.0 | 0 |
| 786.0 | 0 |
| 785.0 | 0 |
| 784.0 | 0 |
| 783.0 | 0 |
| 782.0 | 0 |
| 781.0 | 0 |
| 780.0 | 0 |
| 779.0 | 0 |
| 778.0 | 0 |
| 777.0 | 0 |
| 776.0 | 0 |
| 775.0 | 0 |
| 774.0 | 0 |
| 773.0 | 0 |
| 772.0 | 0 |
| 771.0 | 0 |
| 770.0 | 0 |
| 769.0 | 0 |
| 768.0 | 0 |
| 767.0 | 0 |
| 766.0 | 0 |
| 765.0 | 0 |
| 764.0 | 0 |
| 763.0 | 0 |
| 762.0 | 0 |
| 761.0 | 0 |
| 760.0 | 0 |
| 759.0 | 0 |
| 758.0 | 0 |
| 757.0 | 0 |
| 756.0 | 0 |
| 755.0 | 0 |
| 754.0 | 0 |
| 753.0 | 0 |
| 752.0 | 0 |
| 751.0 | 0 |
| 750.0 | 0 |
| 749.0 | 0 |
| 748.0 | 0 |
| 747.0 | 0 |
| 746.0 | 0 |
| 745.0 | 0 |
| 744.0 | 0 |
| 743.0 | 0 |
| 742.0 | 0 |
| 741.0 | 0 |
| 740.0 | 0 |
| 739.0 | 0 |
| 738.0 | 0 |
| 737.0 | 0 |
| 736.0 | 0 |
| 735.0 | 0 |
| 734.0 | 0 |
| 733.0 | 0 |
| 732.0 | 0 |
| 731.0 | 0 |
| 730.0 | 0 |
| 729.0 | 0 |
| 728.0 | 0 |
| 727.0 | 0 |
| 726.0 | 0 |
| 725.0 | 0 |
| 724.0 | 0 |
| 723.0 | 0 |
| 722.0 | 0 |
| 721.0 | 0 |
| 720.0 | 0 |
| 719.0 | 0 |
| 718.0 | 0 |
| 717.0 | 0 |
| 716.0 | 0 |
| 715.0 | 0 |
| 714.0 | 0 |
| 713.0 | 0 |
| 712.0 | 0 |
| 711.0 | 0 |
| 710.0 | 0 |
| 709.0 | 0 |
| 708.0 | 0 |
| 707.0 | 0 |
| 706.0 | 0 |
| 705.0 | 0 |
| 704.0 | 0 |
| 703.0 | 0 |
| 702.0 | 0 |
| 701.0 | 0 |
| 700.0 | 0 |
| 699.0 | 0 |
| 698.0 | 0 |
| 697.0 | 0 |
| 696.0 | 0 |
| 695.0 | 0 |
| 694.0 | 0 |
| 693.0 | 0 |
| 692.0 | 0 |
| 691.0 | 0 |
| 690.0 | 0 |
| 689.0 | 0 |
| 688.0 | 0 |
| 687.0 | 0 |
| 686.0 | 0 |
| 685.0 | 0 |
| 684.0 | 0 |
| 683.0 | 0 |
| 682.0 | 0 |
| 681.0 | 0 |
| 680.0 | 0 |
| 679.0 | 0 |
| 678.0 | 0 |
| 677.0 | 0 |
| 676.0 | 0 |
| 675.0 | 0 |
| 674.0 | 0 |
| 673.0 | 0 |
| 672.0 | 0 |
| 671.0 | 0 |
| 670.0 | 0 |
| 669.0 | 0 |
| 668.0 | 0 |
| 667.0 | 0 |
| 666.0 | 0 |
| 665.0 | 0 |
| 664.0 | 0 |
| 663.0 | 0 |
| 662.0 | 0 |
| 661.0 | 0 |
| 660.0 | 0 |
| 659.0 | 0 |
| 658.0 | 0 |
| 657.0 | 0 |
| 656.0 | 0 |
| 655.0 | 0 |
| 654.0 | 0 |
| 653.0 | 0 |
| 652.0 | 0 |
| 651.0 | 0 |
| 650.0 | 0 |
| 649.0 | 0 |
| 648.0 | 0 |
| 647.0 | 0 |
| 646.0 | 0 |
| 645.0 | 0 |
| 644.0 | 0 |
| 643.0 | 0 |
| 642.0 | 0 |
| 641.0 | 0 |
| 640.0 | 0 |
| 639.0 | 0 |
| 638.0 | 0 |
| 637.0 | 0 |
| 636.0 | 0 |
| 635.0 | 0 |
| 634.0 | 0 |
| 633.0 | 0 |
| 632.0 | 0 |
| 631.0 | 0 |
| 630.0 | 0 |
| 629.0 | 0 |
| 628.0 | 0 |
| 627.0 | 0 |
| 626.0 | 0 |
| 625.0 | 0 |
| 624.0 | 0 |
| 623.0 | 0 |
| 622.0 | 0 |
| 621.0 | 0 |
| 620.0 | 0 |
| 619.0 | 0 |
| 618.0 | 0 |
| 617.0 | 0 |
| 616.0 | 0 |
| 615.0 | 0 |
| 614.0 | 0 |
| 613.0 | 0 |
| 612.0 | 0 |
| 611.0 | 0 |
| 610.0 | 0 |
| 609.0 | 0 |
| 608.0 | 0 |
| 607.0 | 0 |
| 606.0 | 0 |
| 605.0 | 0 |
| 604.0 | 0 |
| 603.0 | 0 |
| 602.0 | 0 |
| 601.0 | 0 |
| 600.0 | 0 |
| 599.0 | 0 |
| 598.0 | 0 |
| 597.0 | 0 |
| 596.0 | 0 |
| 595.0 | 0 |
| 594.0 | 0 |
| 593.0 | 0 |
| 592.0 | 0 |
| 591.0 | 0 |
| 590.0 | 0 |
| 589.0 | 0 |
| 588.0 | 0 |
| 587.0 | 0 |
| 586.0 | 0 |
| 585.0 | 0 |
| 584.0 | 0 |
| 583.0 | 0 |
| 582.0 | 0 |
| 581.0 | 0 |
| 580.0 | 0 |
| 579.0 | 0 |
| 578.0 | 0 |
| 577.0 | 0 |
| 576.0 | 0 |
| 575.0 | 0 |
| 574.0 | 0 |
| 573.0 | 0 |
| 572.0 | 0 |
| 571.0 | 0 |
| 570.0 | 0 |
| 569.0 | 0 |
| 568.0 | 0 |
| 567.0 | 0 |
| 566.0 | 0 |
| 565.0 | 0 |
| 564.0 | 0 |
| 563.0 | 0 |
| 562.0 | 0 |
| 561.0 | 0 |
| 560.0 | 0 |
| 559.0 | 0 |
| 558.0 | 0 |
| 557.0 | 0 |
| 556.0 | 0 |
| 555.0 | 0 |
| 554.0 | 0 |
| 553.0 | 0 |
| 552.0 | 0 |
| 551.0 | 0 |
| 550.0 | 0 |
| 549.0 | 0 |
| 548.0 | 0 |
| 547.0 | 0 |
| 546.0 | 0 |
| 545.0 | 0 |
| 544.0 | 0 |
| 543.0 | 0 |
| 542.0 | 0 |
| 541.0 | 0 |
| 540.0 | 0 |
| 539.0 | 0 |
| 538.0 | 0 |
| 537.0 | 0 |
| 536.0 | 0 |
| 535.0 | 0 |
| 534.0 | 0 |
| 533.0 | 0 |
| 532.0 | 0 |
| 531.0 | 0 |
| 530.0 | 0 |
| 529.0 | 0 |
| 528.0 | 0 |
| 527.0 | 0 |
| 526.0 | 0 |
| 525.0 | 0 |
| 524.0 | 0 |
| 523.0 | 0 |
| 522.0 | 0 |
| 521.0 | 0 |
| 520.0 | 0 |
| 519.0 | 0 |
| 518.0 | 0 |
| 517.0 | 0 |
| 516.0 | 0 |
| 515.0 | 0 |
| 514.0 | 0 |
| 513.0 | 0 |
| 512.0 | 0 |
| 511.0 | 0 |
| 510.0 | 0 |
| 509.0 | 0 |
| 508.0 | 0 |
| 507.0 | 0 |
| 506.0 | 0 |
| 505.0 | 0 |
| 504.0 | 0 |
| 503.0 | 0 |
| 502.0 | 0 |
| 501.0 | 0 |
| 500.0 | 0 |
| 499.0 | 0 |
| 498.0 | 0 |
| 497.0 | 0 |
| 496.0 | 0 |
| 495.0 | 0 |
| 494.0 | 0 |
| 493.0 | 0 |
| 492.0 | 0 |
| 491.0 | 0 |
| 490.0 | 0 |
| 489.0 | 0 |
| 488.0 | 0 |
| 487.0 | 0 |
| 486.0 | 0 |
| 485.0 | 0 |
| 484.0 | 0 |
| 483.0 | 0 |
| 482.0 | 0 |
| 481.0 | 0 |
| 480.0 | 0 |
| 479.0 | 0 |
| 478.0 | 0 |
| 477.0 | 0 |
| 476.0 | 0 |
| 475.0 | 0 |
| 474.0 | 0 |
| 473.0 | 0 |
| 472.0 | 0 |
| 471.0 | 0 |
| 470.0 | 0 |
| 469.0 | 0 |
| 468.0 | 0 |
| 467.0 | 0 |
| 466.0 | 0 |
| 465.0 | 0 |
| 464.0 | 0 |
| 463.0 | 0 |
| 462.0 | 0 |
| 461.0 | 0 |
| 460.0 | 0 |
| 459.0 | 0 |
| 458.0 | 0 |
| 457.0 | 0 |
| 456.0 | 0 |
| 455.0 | 0 |
| 454.0 | 0 |
| 453.0 | 0 |
| 452.0 | 0 |
| 451.0 | 0 |
| 450.0 | 0 |
| 449.0 | 0 |
| 448.0 | 0 |
| 447.0 | 0 |
| 446.0 | 0 |
| 445.0 | 0 |
| 444.0 | 0 |
| 443.0 | 0 |
| 442.0 | 0 |
| 441.0 | 0 |
| 440.0 | 0 |
| 439.0 | 0 |
| 438.0 | 0 |
| 437.0 | 0 |
| 436.0 | 0 |
| 435.0 | 0 |
| 434.0 | 0 |
| 433.0 | 0 |
| 432.0 | 0 |
| 431.0 | 0 |
| 430.0 | 0 |
| 429.0 | 0 |
| 428.0 | 0 |
| 427.0 | 0 |
| 426.0 | 0 |
| 425.0 | 0 |
| 424.0 | 0 |
| 423.0 | 0 |
| 422.0 | 0 |
| 421.0 | 0 |
| 420.0 | 0 |
| 419.0 | 0 |
| 418.0 | 0 |
| 417.0 | 0 |
| 416.0 | 0 |
| 415.0 | 0 |
| 414.0 | 0 |
| 413.0 | 0 |
| 412.0 | 0 |
| 411.0 | 0 |
| 410.0 | 0 |
| 409.0 | 0 |
| 408.0 | 0 |
| 407.0 | 0 |
| 406.0 | 0 |
| 405.0 | 0 |
| 404.0 | 0 |
| 403.0 | 0 |
| 402.0 | 0 |
| 401.0 | 0 |
| 400.0 | 0 |
| 399.0 | 0 |
| 398.0 | 0 |
| 397.0 | 0 |
| 396.0 | 0 |
| 395.0 | 0 |
| 394.0 | 0 |
| 393.0 | 0 |
| 392.0 | 0 |
| 391.0 | 0 |
| 390.0 | 0 |
| 389.0 | 0 |
| 388.0 | 0 |
| 387.0 | 0 |
| 386.0 | 0 |
| 385.0 | 0 |
| 384.0 | 0 |
| 383.0 | 0 |
| 382.0 | 0 |
| 381.0 | 0 |
| 380.0 | 0 |
| 379.0 | 0 |
| 378.0 | 0 |
| 377.0 | 0 |
| 376.0 | 0 |
| 375.0 | 0 |
| 374.0 | 0 |
| 373.0 | 0 |
| 372.0 | 0 |
| 371.0 | 0 |
| 370.0 | 0 |
| 369.0 | 0 |
| 368.0 | 0 |
| 367.0 | 0 |
| 366.0 | 0 |
| 365.0 | 0 |
| 364.0 | 0 |
| 363.0 | 0 |
| 362.0 | 0 |
| 361.0 | 0 |
| 360.0 | 0 |
| 359.0 | 0 |
| 358.0 | 0 |
| 357.0 | 0 |
| 356.0 | 0 |
| 355.0 | 0 |
| 354.0 | 0 |
| 353.0 | 0 |
| 352.0 | 0 |
| 351.0 | 0 |
| 350.0 | 0 |
| 349.0 | 0 |
| 348.0 | 0 |
| 347.0 | 0 |
| 346.0 | 0 |
| 345.0 | 0 |
| 344.0 | 0 |
| 343.0 | 0 |
| 342.0 | 0 |
| 341.0 | 0 |
| 340.0 | 0 |
| 339.0 | 0 |
| 338.0 | 0 |
| 337.0 | 0 |
| 336.0 | 0 |
| 335.0 | 0 |
| 334.0 | 0 |
| 333.0 | 0 |
| 332.0 | 0 |
| 331.0 | 0 |
| 330.0 | 0 |
| 329.0 | 0 |
| 328.0 | 0 |
| 327.0 | 0 |
| 326.0 | 0 |
| 325.0 | 0 |
| 324.0 | 0 |
| 323.0 | 0 |
| 322.0 | 0 |
| 321.0 | 0 |
| 320.0 | 0 |
| 319.0 | 0 |
| 318.0 | 0 |
| 317.0 | 0 |
| 316.0 | 0 |
| 315.0 | 0 |
| 314.0 | 0 |
| 313.0 | 0 |
| 312.0 | 0 |
| 311.0 | 0 |
| 310.0 | 0 |
| 309.0 | 0 |
| 308.0 | 0 |
| 307.0 | 0 |
| 306.0 | 0 |
| 305.0 | 0 |
| 304.0 | 0 |
| 303.0 | 0 |
| 302.0 | 0 |
| 301.0 | 0 |
| 300.0 | 0 |
| 299.0 | 0 |
| 298.0 | 0 |
| 297.0 | 0 |
| 296.0 | 0 |
| 295.0 | 0 |
| 294.0 | 0 |
| 293.0 | 0 |
| 292.0 | 0 |
| 291.0 | 0 |
| 290.0 | 0 |
| 289.0 | 0 |
| 288.0 | 0 |
| 287.0 | 0 |
| 286.0 | 0 |
| 285.0 | 0 |
| 284.0 | 0 |
| 283.0 | 0 |